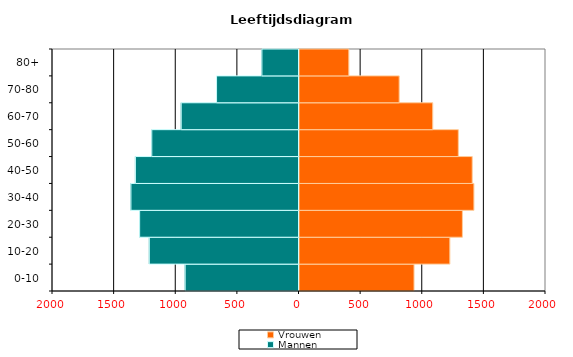
| Category | Vrouwen | Mannen |
|---|---|---|
| 0-10 | 937.389 | -923.663 |
| 10-20 | 1228.015 | -1214.426 |
| 20-30 | 1329.774 | -1292.984 |
| 30-40 | 1423.392 | -1363.685 |
| 40-50 | 1409.521 | -1327.317 |
| 50-60 | 1296.759 | -1194.585 |
| 60-70 | 1089.278 | -955.668 |
| 70-80 | 816.958 | -668.968 |
| 80+ | 408.479 | -301.035 |